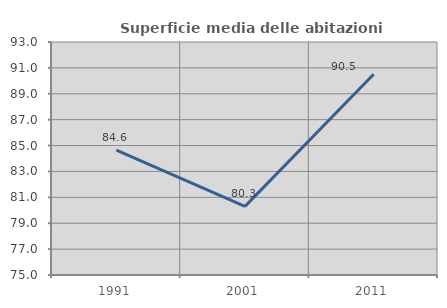
| Category | Superficie media delle abitazioni occupate |
|---|---|
| 1991.0 | 84.644 |
| 2001.0 | 80.298 |
| 2011.0 | 90.509 |